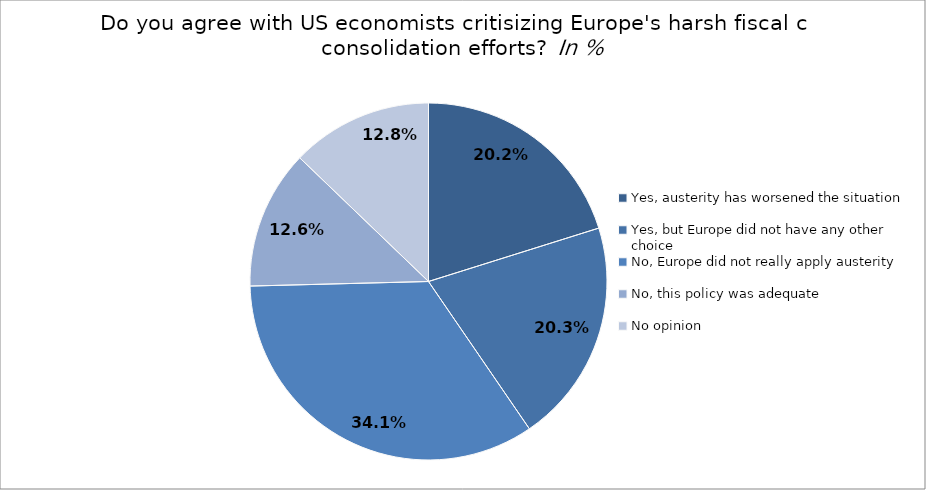
| Category | Doubts on austerity Do you agree with US economists critisizing Europe's harsh fiscal consolidation efforts? In % |
|---|---|
| Yes, austerity has worsened the situation | 0.202 |
| Yes, but Europe did not have any other choice | 0.203 |
| No, Europe did not really apply austerity | 0.341 |
| No, this policy was adequate | 0.126 |
| No opinion | 0.128 |